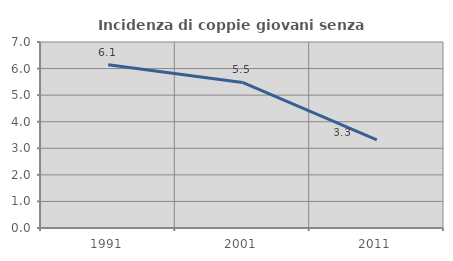
| Category | Incidenza di coppie giovani senza figli |
|---|---|
| 1991.0 | 6.14 |
| 2001.0 | 5.479 |
| 2011.0 | 3.318 |